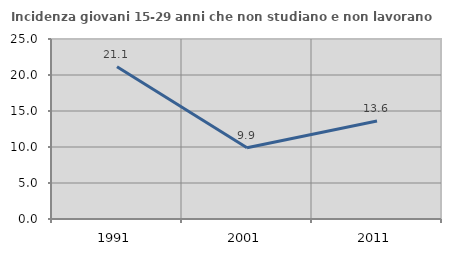
| Category | Incidenza giovani 15-29 anni che non studiano e non lavorano  |
|---|---|
| 1991.0 | 21.147 |
| 2001.0 | 9.888 |
| 2011.0 | 13.615 |